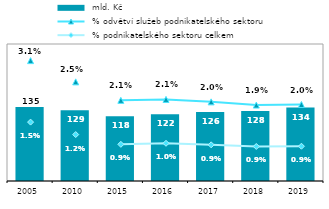
| Category |  mld. Kč  |
|---|---|
| 2005.0 | 134.976 |
| 2010.0 | 129.105 |
| 2015.0 | 118.336 |
| 2016.0 | 121.884 |
| 2017.0 | 125.872 |
| 2018.0 | 127.568 |
| 2019.0 | 133.968 |